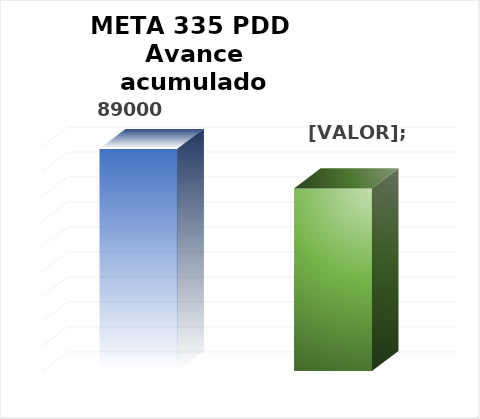
| Category | Meta PDD 2024 |
|---|---|
| 0 | 89000 |
| 1 | 73080 |